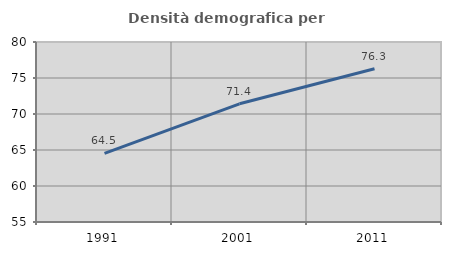
| Category | Densità demografica |
|---|---|
| 1991.0 | 64.535 |
| 2001.0 | 71.415 |
| 2011.0 | 76.281 |